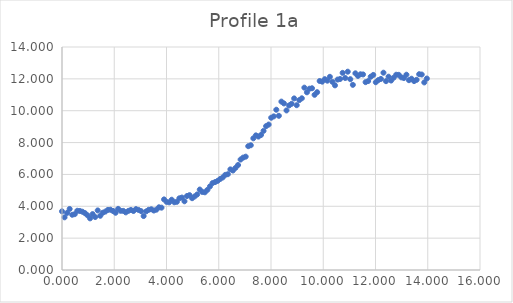
| Category | Series 0 |
|---|---|
| 0.0 | 3.684 |
| 0.09765625 | 3.307 |
| 0.1953125 | 3.583 |
| 0.29296875 | 3.832 |
| 0.390625 | 3.468 |
| 0.48828125 | 3.505 |
| 0.5859375 | 3.719 |
| 0.68359375 | 3.706 |
| 0.78125 | 3.659 |
| 0.87890625 | 3.571 |
| 0.9765625 | 3.434 |
| 1.07421875 | 3.242 |
| 1.171875 | 3.509 |
| 1.26953125 | 3.325 |
| 1.3671875 | 3.74 |
| 1.46484375 | 3.405 |
| 1.5625 | 3.596 |
| 1.66015625 | 3.668 |
| 1.7578125 | 3.773 |
| 1.85546875 | 3.783 |
| 1.953125 | 3.706 |
| 2.05078125 | 3.593 |
| 2.1484375 | 3.838 |
| 2.24609375 | 3.714 |
| 2.34375 | 3.711 |
| 2.44140625 | 3.618 |
| 2.5390625 | 3.712 |
| 2.63671875 | 3.769 |
| 2.734375 | 3.703 |
| 2.83203125 | 3.822 |
| 2.9296875 | 3.771 |
| 3.02734375 | 3.696 |
| 3.125 | 3.388 |
| 3.22265625 | 3.681 |
| 3.3203125 | 3.78 |
| 3.41796875 | 3.813 |
| 3.515625 | 3.734 |
| 3.61328125 | 3.787 |
| 3.7109375 | 3.936 |
| 3.80859375 | 3.914 |
| 3.90625 | 4.432 |
| 4.00390625 | 4.276 |
| 4.1015625 | 4.247 |
| 4.19921875 | 4.411 |
| 4.296875 | 4.253 |
| 4.39453125 | 4.278 |
| 4.4921875 | 4.501 |
| 4.58984375 | 4.548 |
| 4.6875 | 4.314 |
| 4.78515625 | 4.645 |
| 4.8828125 | 4.7 |
| 4.98046875 | 4.508 |
| 5.078125 | 4.618 |
| 5.17578125 | 4.745 |
| 5.2734375 | 5.051 |
| 5.37109375 | 4.898 |
| 5.46875 | 4.878 |
| 5.56640625 | 5.032 |
| 5.6640625 | 5.248 |
| 5.76171875 | 5.456 |
| 5.859375 | 5.52 |
| 5.95703125 | 5.594 |
| 6.0546875 | 5.715 |
| 6.15234375 | 5.81 |
| 6.25 | 5.973 |
| 6.34765625 | 6.013 |
| 6.4453125 | 6.317 |
| 6.54296875 | 6.246 |
| 6.640625 | 6.409 |
| 6.73828125 | 6.589 |
| 6.8359375 | 6.934 |
| 6.93359375 | 7.057 |
| 7.03125 | 7.115 |
| 7.12890625 | 7.773 |
| 7.2265625 | 7.831 |
| 7.32421875 | 8.266 |
| 7.421875 | 8.452 |
| 7.51953125 | 8.376 |
| 7.6171875 | 8.478 |
| 7.71484375 | 8.735 |
| 7.8125 | 9.033 |
| 7.91015625 | 9.131 |
| 8.0078125 | 9.56 |
| 8.10546875 | 9.645 |
| 8.203125 | 10.062 |
| 8.30078125 | 9.68 |
| 8.3984375 | 10.572 |
| 8.49609375 | 10.457 |
| 8.59375 | 10.018 |
| 8.69140625 | 10.329 |
| 8.7890625 | 10.435 |
| 8.88671875 | 10.772 |
| 8.984375 | 10.346 |
| 9.08203125 | 10.666 |
| 9.1796875 | 10.78 |
| 9.27734375 | 11.448 |
| 9.375 | 11.156 |
| 9.47265625 | 11.382 |
| 9.5703125 | 11.409 |
| 9.66796875 | 10.999 |
| 9.765625 | 11.163 |
| 9.86328125 | 11.865 |
| 9.9609375 | 11.824 |
| 10.05859375 | 11.98 |
| 10.15625 | 11.886 |
| 10.25390625 | 12.128 |
| 10.3515625 | 11.811 |
| 10.44921875 | 11.592 |
| 10.546875 | 11.955 |
| 10.64453125 | 11.991 |
| 10.7421875 | 12.376 |
| 10.83984375 | 12.053 |
| 10.9375 | 12.45 |
| 11.03515625 | 11.979 |
| 11.1328125 | 11.624 |
| 11.23046875 | 12.347 |
| 11.328125 | 12.184 |
| 11.42578125 | 12.287 |
| 11.5234375 | 12.277 |
| 11.62109375 | 11.794 |
| 11.71875 | 11.861 |
| 11.81640625 | 12.133 |
| 11.9140625 | 12.246 |
| 12.01171875 | 11.789 |
| 12.109375 | 11.925 |
| 12.20703125 | 11.994 |
| 12.3046875 | 12.386 |
| 12.40234375 | 11.855 |
| 12.5 | 12.136 |
| 12.59765625 | 11.894 |
| 12.6953125 | 12.071 |
| 12.79296875 | 12.258 |
| 12.890625 | 12.252 |
| 12.98828125 | 12.093 |
| 13.0859375 | 12.05 |
| 13.18359375 | 12.259 |
| 13.28125 | 11.916 |
| 13.37890625 | 12.009 |
| 13.4765625 | 11.86 |
| 13.57421875 | 11.94 |
| 13.671875 | 12.292 |
| 13.76953125 | 12.271 |
| 13.8671875 | 11.775 |
| 13.96484375 | 12.02 |